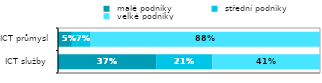
| Category |  malé podniky |  střední podniky |  velké podniky |
|---|---|---|---|
| ICT služby  | 0.375 | 0.215 | 0.411 |
| ICT průmysl | 0.053 | 0.072 | 0.875 |